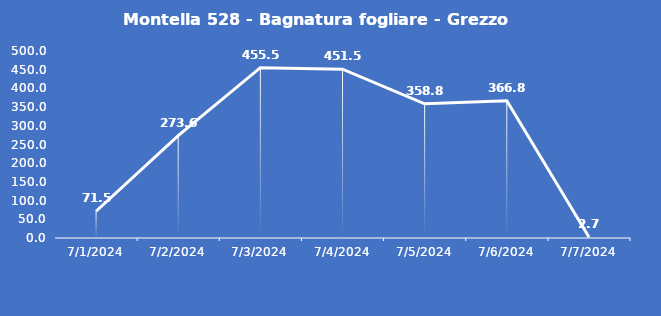
| Category | Montella 528 - Bagnatura fogliare - Grezzo (min) |
|---|---|
| 7/1/24 | 71.5 |
| 7/2/24 | 273.6 |
| 7/3/24 | 455.5 |
| 7/4/24 | 451.5 |
| 7/5/24 | 358.8 |
| 7/6/24 | 366.8 |
| 7/7/24 | 2.7 |